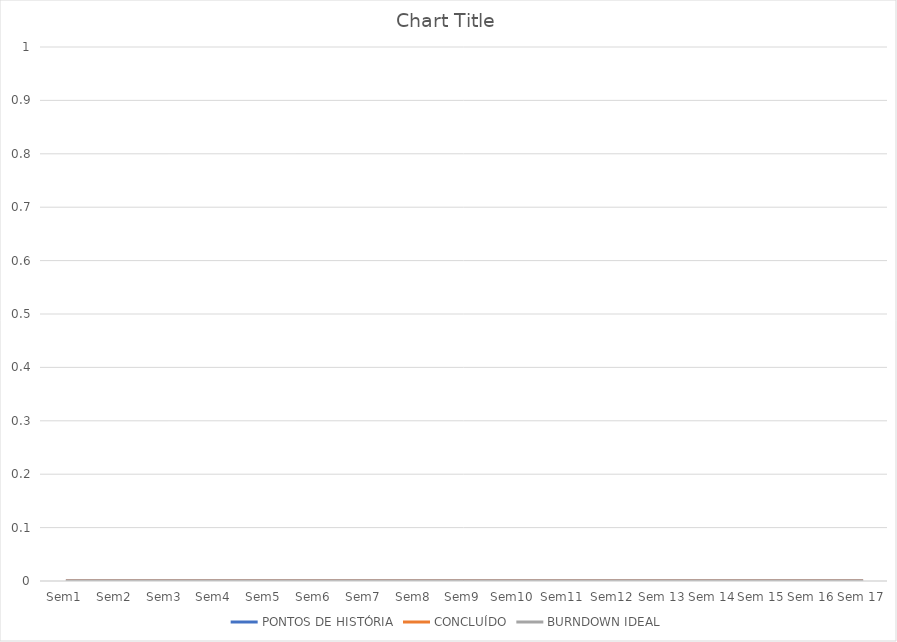
| Category | PONTOS DE HISTÓRIA | CONCLUÍDO | BURNDOWN IDEAL |
|---|---|---|---|
| Sem1 | 0 | 0 | 0 |
| Sem2 | 0 | 0 | 0 |
| Sem3 | 0 | 0 | 0 |
| Sem4 | 0 | 0 | 0 |
| Sem5 | 0 | 0 | 0 |
| Sem6 | 0 | 0 | 0 |
| Sem7 | 0 | 0 | 0 |
| Sem8 | 0 | 0 | 0 |
| Sem9 | 0 | 0 | 0 |
| Sem10 | 0 | 0 | 0 |
| Sem11 | 0 | 0 | 0 |
| Sem12 | 0 | 0 | 0 |
| Sem 13 | 0 | 0 | 0 |
| Sem 14 | 0 | 0 | 0 |
| Sem 15 | 0 | 0 | 0 |
| Sem 16 | 0 | 0 | 0 |
| Sem 17 | 0 | 0 | 0 |